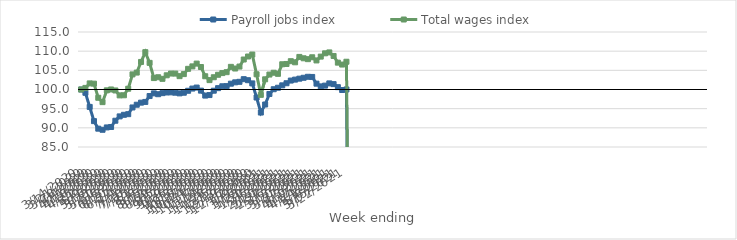
| Category | Payroll jobs index | Total wages index |
|---|---|---|
| 14/03/2020 | 100 | 100 |
| 21/03/2020 | 99.137 | 100.416 |
| 28/03/2020 | 95.458 | 101.592 |
| 04/04/2020 | 91.749 | 101.528 |
| 11/04/2020 | 89.782 | 97.842 |
| 18/04/2020 | 89.494 | 96.703 |
| 25/04/2020 | 90.106 | 99.78 |
| 02/05/2020 | 90.219 | 100.01 |
| 09/05/2020 | 91.852 | 99.75 |
| 16/05/2020 | 92.983 | 98.463 |
| 23/05/2020 | 93.398 | 98.493 |
| 30/05/2020 | 93.564 | 100.203 |
| 06/06/2020 | 95.316 | 103.94 |
| 13/06/2020 | 96.028 | 104.414 |
| 20/06/2020 | 96.57 | 107.187 |
| 27/06/2020 | 96.756 | 109.738 |
| 04/07/2020 | 98.294 | 106.954 |
| 11/07/2020 | 98.99 | 102.98 |
| 18/07/2020 | 98.77 | 103.199 |
| 25/07/2020 | 99.05 | 102.78 |
| 01/08/2020 | 99.224 | 103.702 |
| 08/08/2020 | 99.257 | 104.165 |
| 15/08/2020 | 99.166 | 104.15 |
| 22/08/2020 | 98.99 | 103.482 |
| 29/08/2020 | 99.157 | 104.018 |
| 05/09/2020 | 99.666 | 105.392 |
| 12/09/2020 | 100.242 | 106.029 |
| 19/09/2020 | 100.509 | 106.757 |
| 26/09/2020 | 99.704 | 105.867 |
| 03/10/2020 | 98.412 | 103.454 |
| 10/10/2020 | 98.549 | 102.447 |
| 17/10/2020 | 99.69 | 103.199 |
| 24/10/2020 | 100.352 | 103.843 |
| 31/10/2020 | 100.843 | 104.281 |
| 07/11/2020 | 100.883 | 104.522 |
| 14/11/2020 | 101.517 | 105.907 |
| 21/11/2020 | 101.87 | 105.47 |
| 28/11/2020 | 102.005 | 105.986 |
| 05/12/2020 | 102.693 | 107.823 |
| 12/12/2020 | 102.426 | 108.605 |
| 19/12/2020 | 101.592 | 109.122 |
| 26/12/2020 | 97.908 | 103.968 |
| 02/01/2021 | 93.988 | 98.602 |
| 09/01/2021 | 96.085 | 102.656 |
| 16/01/2021 | 98.836 | 103.9 |
| 23/01/2021 | 100.07 | 104.374 |
| 30/01/2021 | 100.459 | 104.088 |
| 06/02/2021 | 101.082 | 106.583 |
| 13/02/2021 | 101.633 | 106.656 |
| 20/02/2021 | 102.328 | 107.386 |
| 27/02/2021 | 102.579 | 107.093 |
| 06/03/2021 | 102.829 | 108.5 |
| 13/03/2021 | 103.059 | 108.143 |
| 20/03/2021 | 103.316 | 107.914 |
| 27/03/2021 | 103.276 | 108.408 |
| 03/04/2021 | 101.52 | 107.582 |
| 10/04/2021 | 100.813 | 108.58 |
| 17/04/2021 | 101.012 | 109.436 |
| 24/04/2021 | 101.591 | 109.674 |
| 01/05/2021 | 101.398 | 108.75 |
| 08/05/2021 | 100.608 | 107.007 |
| 15/05/2021 | 99.868 | 106.509 |
| 22/05/2021 | 100.011 | 107.242 |